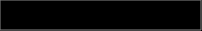
| Category | Series 0 |
|---|---|
| 0 | 0.303 |
| 1 | 0.662 |
| 2 | 0.035 |